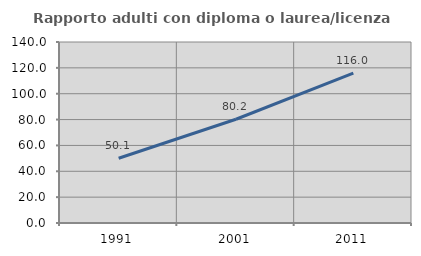
| Category | Rapporto adulti con diploma o laurea/licenza media  |
|---|---|
| 1991.0 | 50.088 |
| 2001.0 | 80.236 |
| 2011.0 | 115.994 |